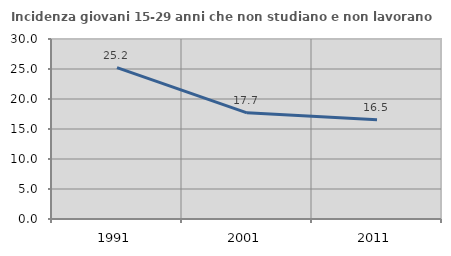
| Category | Incidenza giovani 15-29 anni che non studiano e non lavorano  |
|---|---|
| 1991.0 | 25.229 |
| 2001.0 | 17.69 |
| 2011.0 | 16.535 |